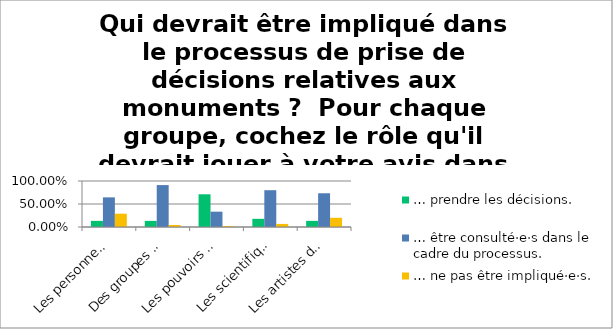
| Category | … prendre les décisions. | … être consulté·e·s dans le cadre du processus. | … ne pas être impliqué·e·s. |
|---|---|---|---|
| Les personnes ayant le droit de vote devraient … | 0.133 | 0.644 | 0.289 |
| Des groupes de la société civile devraient … | 0.133 | 0.911 | 0.044 |
| Les pouvoirs publics et les autorités compétentes devraient … | 0.711 | 0.333 | 0.022 |
| Les scientifiques (p. ex. historien·ne·s) devraient … | 0.178 | 0.8 | 0.067 |
| Les artistes devraient … | 0.133 | 0.733 | 0.2 |